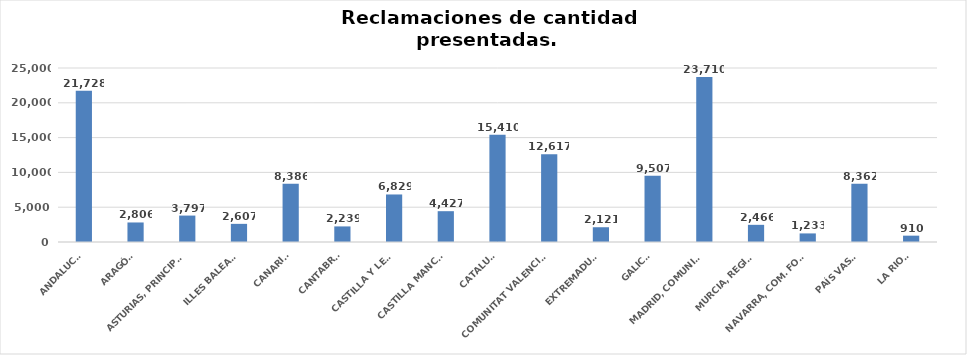
| Category | Series 0 |
|---|---|
| ANDALUCÍA | 21728 |
| ARAGÓN | 2806 |
| ASTURIAS, PRINCIPADO | 3797 |
| ILLES BALEARS | 2607 |
| CANARIAS | 8386 |
| CANTABRIA | 2239 |
| CASTILLA Y LEÓN | 6829 |
| CASTILLA MANCHA | 4427 |
| CATALUÑA | 15410 |
| COMUNITAT VALENCIANA | 12617 |
| EXTREMADURA | 2121 |
| GALICIA | 9507 |
| MADRID, COMUNIDAD | 23710 |
| MURCIA, REGIÓN | 2466 |
| NAVARRA, COM. FORAL | 1233 |
| PAÍS VASCO | 8362 |
| LA RIOJA | 910 |